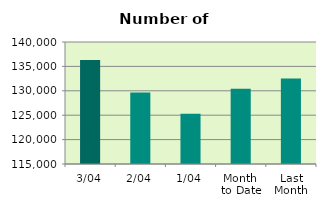
| Category | Series 0 |
|---|---|
| 3/04 | 136310 |
| 2/04 | 129646 |
| 1/04 | 125290 |
| Month 
to Date | 130415.333 |
| Last
Month | 132498.571 |